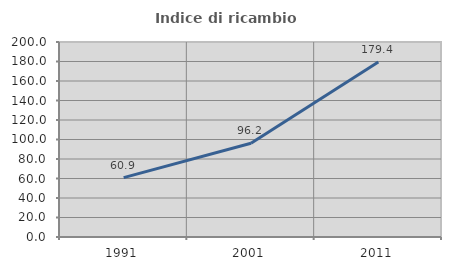
| Category | Indice di ricambio occupazionale  |
|---|---|
| 1991.0 | 60.859 |
| 2001.0 | 96.193 |
| 2011.0 | 179.412 |